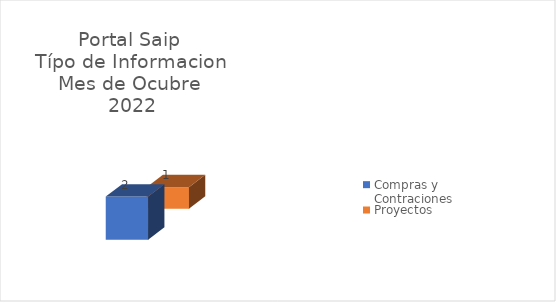
| Category | Compras y Contraciones | Proyectos |
|---|---|---|
| 0 | 2 | 1 |